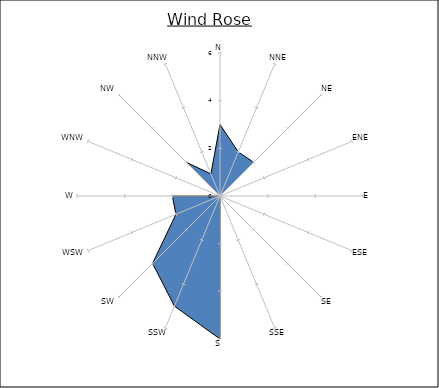
| Category | Series 0 |
|---|---|
| N | 3 |
| NNE | 2 |
| NE | 2 |
| ENE | 0 |
| E | 0 |
| ESE | 0 |
| SE | 0 |
| SSE | 0 |
| S | 6 |
| SSW | 5 |
| SW | 4 |
| WSW | 2 |
| W | 2 |
| WNW | 0 |
| NW | 2 |
| NNW | 1 |